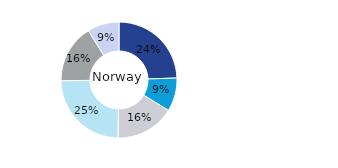
| Category | Norway |
|---|---|
| Office | 0.244 |
| Residential | 0.093 |
| Retail | 0.165 |
| Logistics* | 0.245 |
| Public Sector | 0.164 |
| Other | 0.088 |